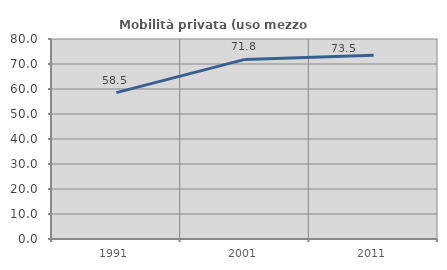
| Category | Mobilità privata (uso mezzo privato) |
|---|---|
| 1991.0 | 58.539 |
| 2001.0 | 71.849 |
| 2011.0 | 73.45 |